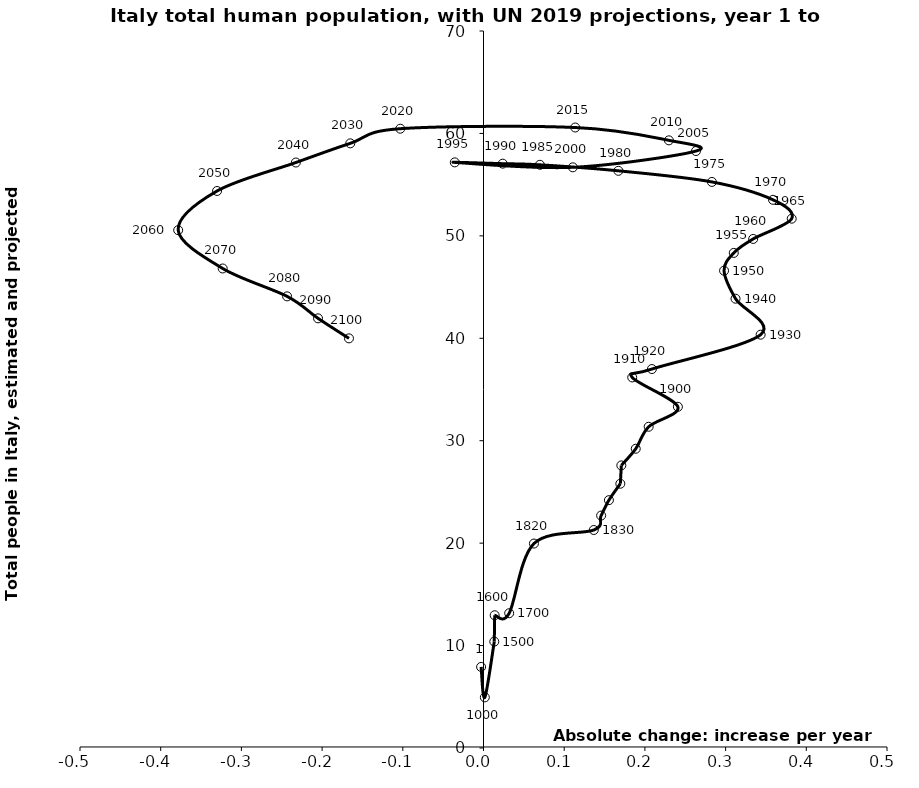
| Category | Series 0 |
|---|---|
| -0.002967748710327988 | 7.914 |
| 0.0016498491829708632 | 4.946 |
| 0.013354869196475943 | 10.387 |
| 0.013849493981530604 | 12.959 |
| 0.03181786344588008 | 13.157 |
| 0.06249774399467632 | 19.959 |
| 0.13666482811060376 | 21.282 |
| 0.14576592415560957 | 22.692 |
| 0.15541110746417566 | 24.197 |
| 0.169557376316739 | 25.801 |
| 0.17079393827937556 | 27.588 |
| 0.18864989301984902 | 29.216 |
| 0.2046757360556203 | 31.361 |
| 0.24088227032162166 | 33.31 |
| 0.18429719491136787 | 36.179 |
| 0.20868219681456282 | 36.996 |
| 0.3434179882634535 | 40.352 |
| 0.3123060892835152 | 43.864 |
| 0.29808418745214926 | 46.599 |
| 0.31013500000000105 | 48.336 |
| 0.3341678999999978 | 49.7 |
| 0.3819018000000035 | 51.677 |
| 0.3588027000000039 | 53.519 |
| 0.28303800000000195 | 55.265 |
| 0.16714899999999702 | 56.349 |
| 0.06988869999999778 | 56.937 |
| 0.023763400000001413 | 57.048 |
| -0.0356057999999976 | 57.174 |
| 0.11068040000000465 | 56.692 |
| 0.2633051000000002 | 58.281 |
| 0.229728199999996 | 59.325 |
| 0.11365969999999806 | 60.578 |
| -0.10313460000000087 | 60.462 |
| -0.16507325 | 59.031 |
| -0.23249010000000006 | 57.16 |
| -0.330173649999999 | 54.382 |
| -0.3783481999999996 | 50.557 |
| -0.32315889999999997 | 46.815 |
| -0.2433786999999999 | 44.094 |
| -0.20503980000000013 | 41.947 |
| -0.16670090000000037 | 39.993 |